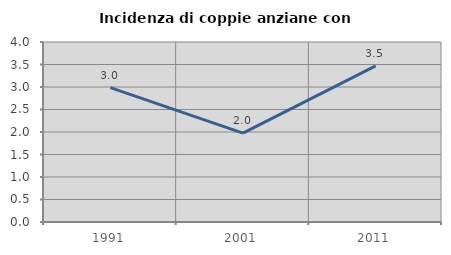
| Category | Incidenza di coppie anziane con figli |
|---|---|
| 1991.0 | 2.985 |
| 2001.0 | 1.974 |
| 2011.0 | 3.468 |